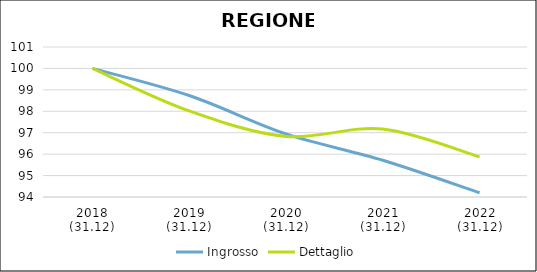
| Category | Ingrosso | Dettaglio |
|---|---|---|
| 2018
(31.12) | 100 | 100 |
| 2019
(31.12) | 98.735 | 98.017 |
| 2020
(31.12) | 96.943 | 96.825 |
| 2021
(31.12) | 95.716 | 97.176 |
| 2022
(31.12) | 94.197 | 95.874 |